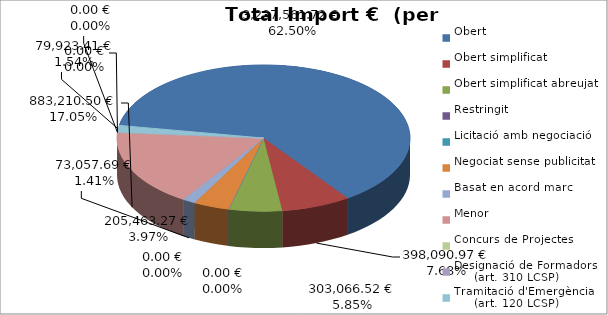
| Category | Total preu
(amb IVA) |
|---|---|
| Obert | 3237561.72 |
| Obert simplificat | 398090.97 |
| Obert simplificat abreujat | 303066.52 |
| Restringit | 0 |
| Licitació amb negociació | 0 |
| Negociat sense publicitat | 205463.27 |
| Basat en acord marc | 73057.69 |
| Menor | 883210.5 |
| Concurs de Projectes | 0 |
| Designació de Formadors
     (art. 310 LCSP) | 0 |
| Tramitació d'Emergència
     (art. 120 LCSP) | 79923.41 |